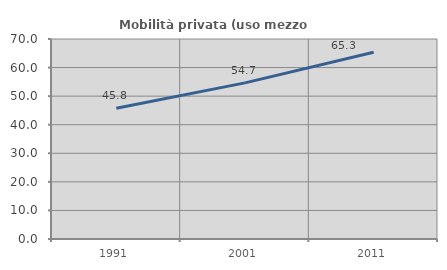
| Category | Mobilità privata (uso mezzo privato) |
|---|---|
| 1991.0 | 45.757 |
| 2001.0 | 54.651 |
| 2011.0 | 65.34 |